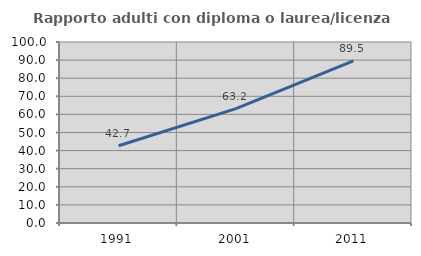
| Category | Rapporto adulti con diploma o laurea/licenza media  |
|---|---|
| 1991.0 | 42.697 |
| 2001.0 | 63.158 |
| 2011.0 | 89.527 |